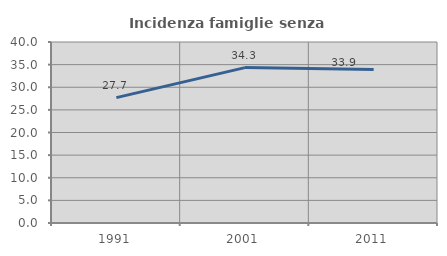
| Category | Incidenza famiglie senza nuclei |
|---|---|
| 1991.0 | 27.7 |
| 2001.0 | 34.339 |
| 2011.0 | 33.924 |